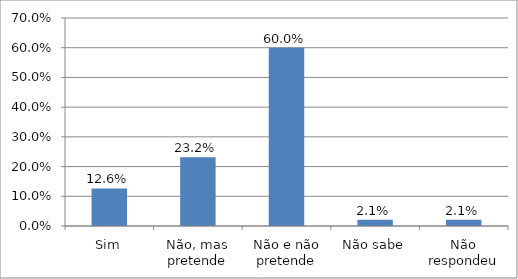
| Category | Series 0 |
|---|---|
| Sim | 0.126 |
| Não, mas pretende | 0.232 |
| Não e não pretende | 0.6 |
| Não sabe | 0.021 |
| Não respondeu | 0.021 |